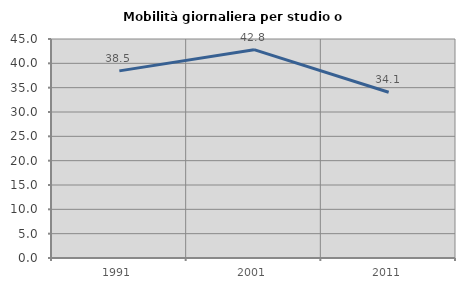
| Category | Mobilità giornaliera per studio o lavoro |
|---|---|
| 1991.0 | 38.451 |
| 2001.0 | 42.811 |
| 2011.0 | 34.053 |